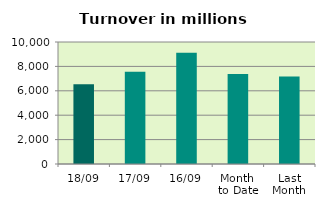
| Category | Series 0 |
|---|---|
| 18/09 | 6527.566 |
| 17/09 | 7571.045 |
| 16/09 | 9118.49 |
| Month 
to Date | 7374.571 |
| Last
Month | 7181.07 |